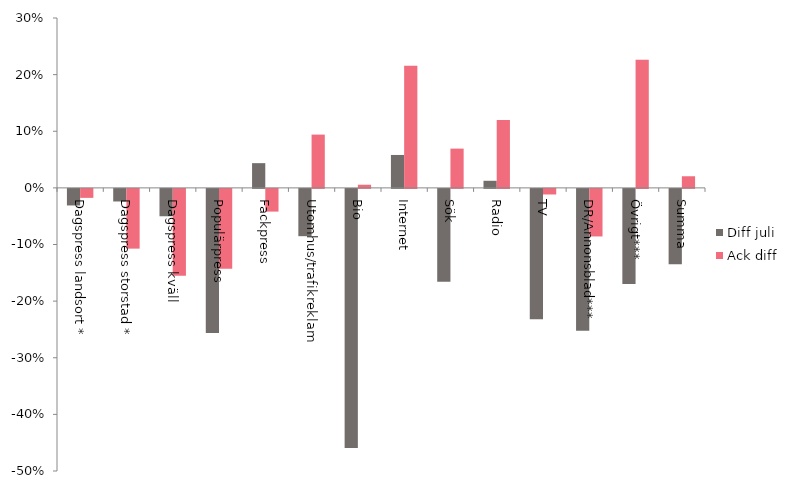
| Category | Diff juli | Ack diff |
|---|---|---|
| Dagspress landsort * | -0.029 | -0.016 |
| Dagspress storstad * | -0.022 | -0.106 |
| Dagspress kväll | -0.048 | -0.153 |
| Populärpress | -0.255 | -0.141 |
| Fackpress | 0.044 | -0.04 |
| Utomhus/trafikreklam | -0.084 | 0.094 |
| Bio | -0.458 | 0.006 |
| Internet | 0.058 | 0.216 |
| Sök | -0.164 | 0.069 |
| Radio | 0.013 | 0.12 |
| TV | -0.23 | -0.01 |
| DR/Annonsblad*** | -0.25 | -0.084 |
| Övrigt*** | -0.168 | 0.226 |
| Summa | -0.133 | 0.021 |